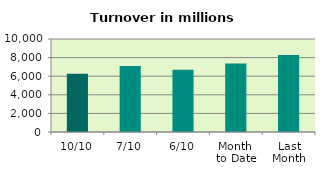
| Category | Series 0 |
|---|---|
| 10/10 | 6254.044 |
| 7/10 | 7086.078 |
| 6/10 | 6698.927 |
| Month 
to Date | 7372.597 |
| Last
Month | 8284.199 |